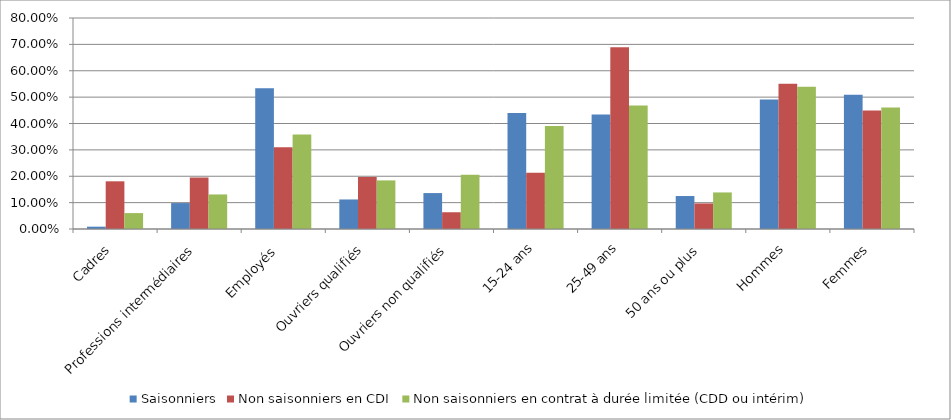
| Category | Saisonniers | Non saisonniers en CDI | Non saisonniers en contrat à durée limitée (CDD ou intérim) |
|---|---|---|---|
| Cadres | 0.009 | 0.181 | 0.06 |
| Professions intermédiaires | 0.098 | 0.195 | 0.131 |
| Employés  | 0.534 | 0.31 | 0.358 |
| Ouvriers qualifiés | 0.112 | 0.197 | 0.184 |
| Ouvriers non qualifiés | 0.136 | 0.063 | 0.205 |
| 15-24 ans | 0.44 | 0.213 | 0.391 |
| 25-49 ans | 0.434 | 0.689 | 0.468 |
| 50 ans ou plus | 0.125 | 0.097 | 0.139 |
| Hommes | 0.491 | 0.551 | 0.539 |
| Femmes | 0.509 | 0.449 | 0.461 |